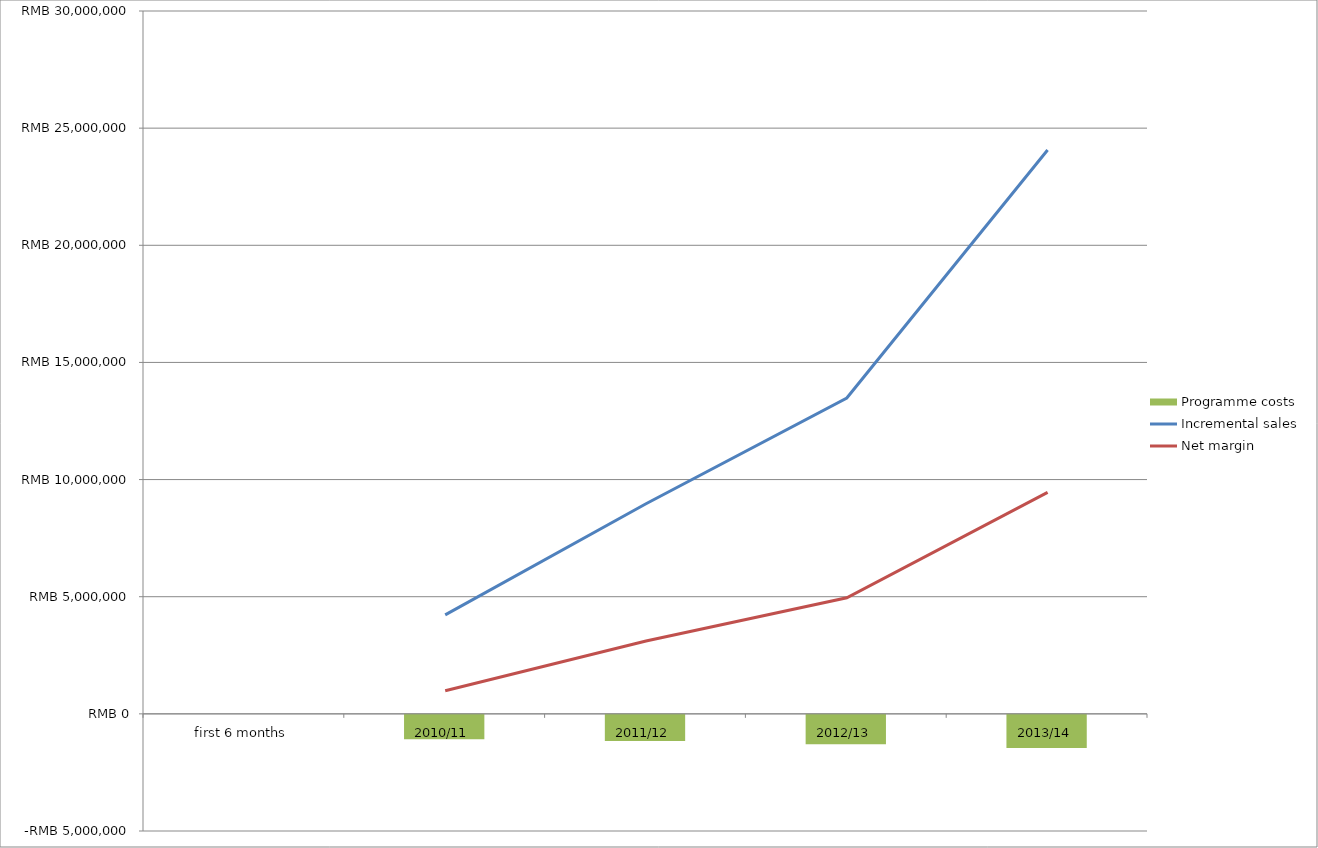
| Category | Programme costs |
|---|---|
| first 6 months | 0 |
| 2010/11 | -1043978.65 |
| 2011/12 | -1111397.65 |
| 2012/13 | -1256817.65 |
| 2013/14 | -1418737.65 |